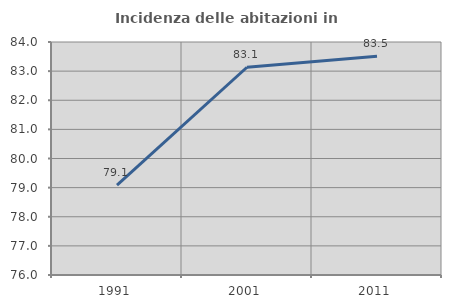
| Category | Incidenza delle abitazioni in proprietà  |
|---|---|
| 1991.0 | 79.085 |
| 2001.0 | 83.133 |
| 2011.0 | 83.513 |